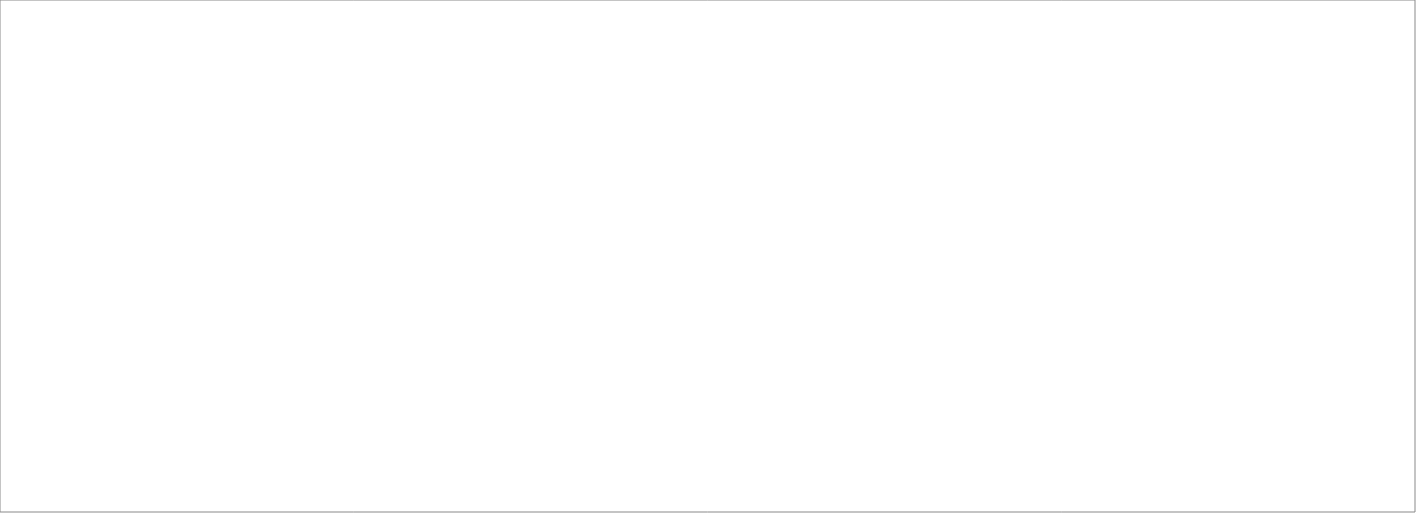
| Category | Total |
|---|---|
| Assessio Sverige AB | 100 |
| Michael Catenacci AB | 70 |
| Talogy Sweden AB | 70 |
| Pro Astri AB | 70 |
| Randstad AB | 70 |